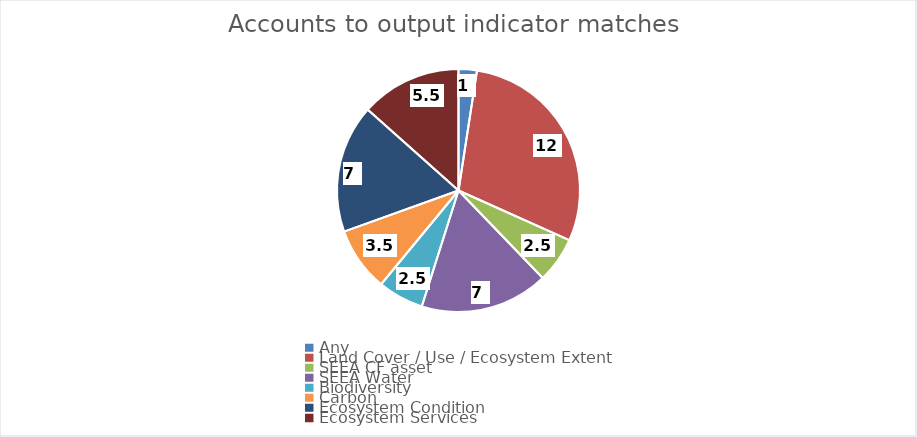
| Category | Series 0 |
|---|---|
| Any | 1 |
| Land Cover / Use / Ecosystem Extent | 12 |
| SEEA CF asset | 2.5 |
| SEEA Water | 7 |
| Biodiversity | 2.5 |
| Carbon | 3.5 |
| Ecosystem Condition | 7 |
| Ecosystem Services | 5.5 |